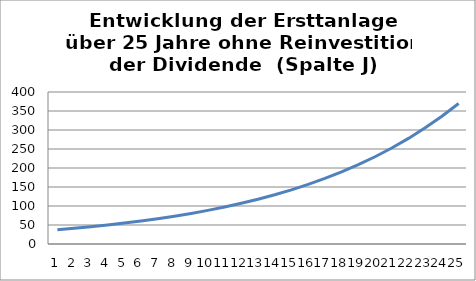
| Category | Series 0 |
|---|---|
| 0 | 37.549 |
| 1 | 41.304 |
| 2 | 45.434 |
| 3 | 49.977 |
| 4 | 54.975 |
| 5 | 60.473 |
| 6 | 66.52 |
| 7 | 73.172 |
| 8 | 80.489 |
| 9 | 88.538 |
| 10 | 97.392 |
| 11 | 107.131 |
| 12 | 117.844 |
| 13 | 129.628 |
| 14 | 142.591 |
| 15 | 156.85 |
| 16 | 172.535 |
| 17 | 189.789 |
| 18 | 208.768 |
| 19 | 229.645 |
| 20 | 252.609 |
| 21 | 277.87 |
| 22 | 305.657 |
| 23 | 336.223 |
| 24 | 369.845 |